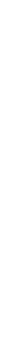
| Category | Número de covenios |
|---|---|
| 2013.0 | 63069 |
| 2014.0 | 62299 |
| 2015.0 | 60506 |